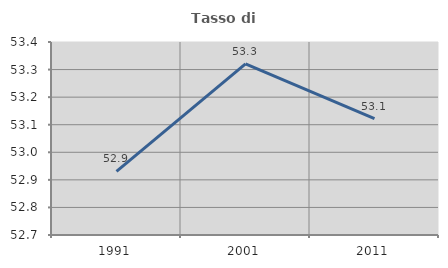
| Category | Tasso di occupazione   |
|---|---|
| 1991.0 | 52.931 |
| 2001.0 | 53.321 |
| 2011.0 | 53.122 |